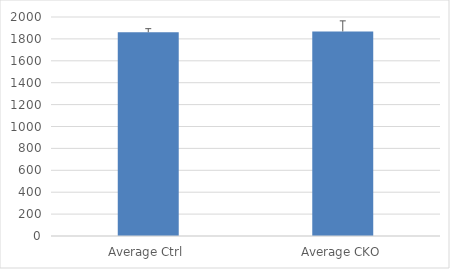
| Category | Series 0 |
|---|---|
| Average Ctrl | 1860.833 |
| Average CKO | 1868.167 |